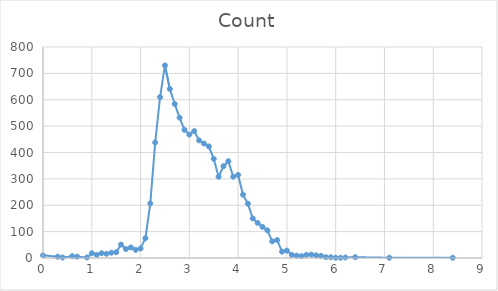
| Category | Count |
|---|---|
| 0.0 | 10 |
| 0.3 | 5 |
| 0.4 | 2 |
| 0.6 | 7 |
| 0.7 | 5 |
| 0.9 | 2 |
| 1.0 | 18 |
| 1.1 | 12 |
| 1.2 | 18 |
| 1.3 | 16 |
| 1.4 | 20 |
| 1.5 | 22 |
| 1.6 | 51 |
| 1.7 | 34 |
| 1.8 | 40 |
| 1.9 | 31 |
| 2.0 | 36 |
| 2.1 | 75 |
| 2.2 | 207 |
| 2.3 | 438 |
| 2.4 | 610 |
| 2.5 | 730 |
| 2.6 | 641 |
| 2.7 | 584 |
| 2.8 | 532 |
| 2.9 | 486 |
| 3.0 | 468 |
| 3.1 | 481 |
| 3.2 | 446 |
| 3.3 | 434 |
| 3.4 | 423 |
| 3.5 | 376 |
| 3.6 | 308 |
| 3.7 | 348 |
| 3.8 | 367 |
| 3.9 | 308 |
| 4.0 | 315 |
| 4.1 | 240 |
| 4.2 | 206 |
| 4.3 | 150 |
| 4.4 | 133 |
| 4.5 | 118 |
| 4.6 | 105 |
| 4.7 | 63 |
| 4.8 | 68 |
| 4.9 | 24 |
| 5.0 | 28 |
| 5.1 | 12 |
| 5.2 | 9 |
| 5.3 | 7 |
| 5.4 | 12 |
| 5.5 | 13 |
| 5.6 | 10 |
| 5.7 | 8 |
| 5.8 | 3 |
| 5.9 | 3 |
| 6.0 | 1 |
| 6.1 | 1 |
| 6.2 | 2 |
| 6.4 | 3 |
| 7.1 | 1 |
| 8.4 | 1 |